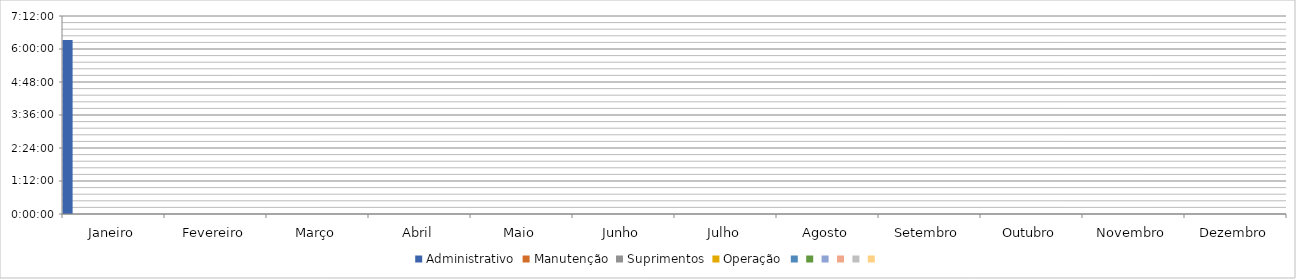
| Category | Administrativo | Manutenção | Suprimentos | Operação | Series 4 | Series 5 | Series 6 | Series 7 | Series 8 | Series 9 |
|---|---|---|---|---|---|---|---|---|---|---|
| Janeiro | 0.264 | 0 | 0 | 0 | 0 | 0 | 0 | 0 | 0 | 0 |
| Fevereiro | 0 | 0 | 0 | 0 | 0 | 0 | 0 | 0 | 0 | 0 |
| Março | 0 | 0 | 0 | 0 | 0 | 0 | 0 | 0 | 0 | 0 |
| Abril | 0 | 0 | 0 | 0 | 0 | 0 | 0 | 0 | 0 | 0 |
| Maio | 0 | 0 | 0 | 0 | 0 | 0 | 0 | 0 | 0 | 0 |
| Junho | 0 | 0 | 0 | 0 | 0 | 0 | 0 | 0 | 0 | 0 |
| Julho | 0 | 0 | 0 | 0 | 0 | 0 | 0 | 0 | 0 | 0 |
| Agosto | 0 | 0 | 0 | 0 | 0 | 0 | 0 | 0 | 0 | 0 |
| Setembro | 0 | 0 | 0 | 0 | 0 | 0 | 0 | 0 | 0 | 0 |
| Outubro | 0 | 0 | 0 | 0 | 0 | 0 | 0 | 0 | 0 | 0 |
| Novembro | 0 | 0 | 0 | 0 | 0 | 0 | 0 | 0 | 0 | 0 |
| Dezembro | 0 | 0 | 0 | 0 | 0 | 0 | 0 | 0 | 0 | 0 |